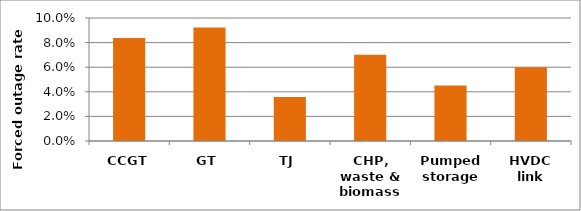
| Category | Series 0 |
|---|---|
| CCGT | 0.084 |
| GT | 0.092 |
| TJ | 0.036 |
| CHP, waste & biomass | 0.07 |
| Pumped storage | 0.045 |
| HVDC link | 0.06 |